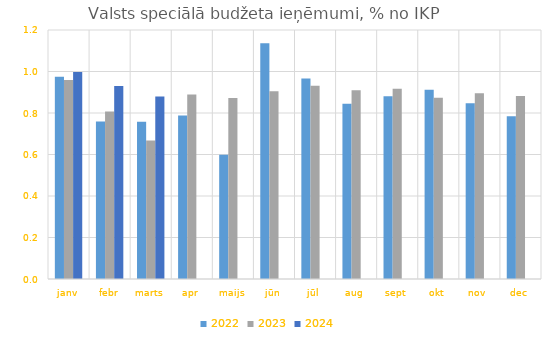
| Category | 2022 | 2023 | 2024 |
|---|---|---|---|
| janv | 0.974 | 0.959 | 0.997 |
| febr | 0.759 | 0.807 | 0.931 |
| marts | 0.758 | 0.668 | 0.88 |
| apr | 0.788 | 0.889 | 0 |
| maijs | 0.599 | 0.872 | 0 |
| jūn | 1.136 | 0.905 | 0 |
| jūl | 0.966 | 0.931 | 0 |
| aug | 0.845 | 0.909 | 0 |
| sept | 0.88 | 0.917 | 0 |
| okt | 0.912 | 0.874 | 0 |
| nov | 0.847 | 0.895 | 0 |
| dec | 0.784 | 0.882 | 0 |